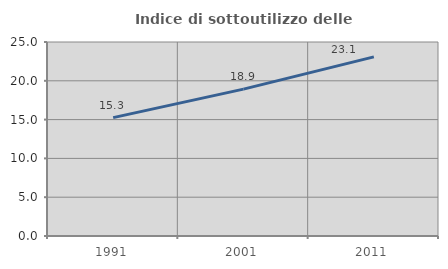
| Category | Indice di sottoutilizzo delle abitazioni  |
|---|---|
| 1991.0 | 15.257 |
| 2001.0 | 18.927 |
| 2011.0 | 23.086 |